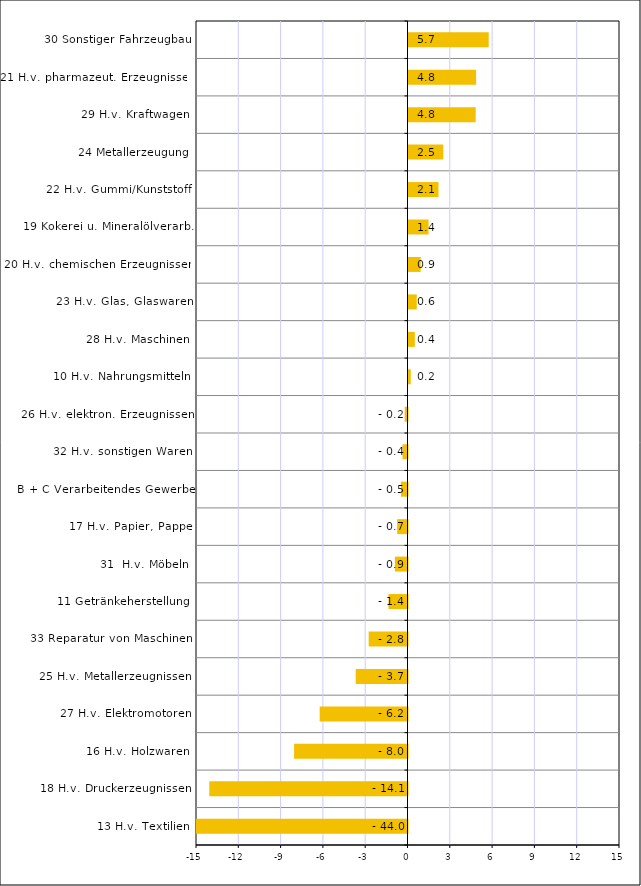
| Category | Series 0 |
|---|---|
| 13 H.v. Textilien | -43.973 |
| 18 H.v. Druckerzeugnissen | -14.057 |
| 16 H.v. Holzwaren | -8.045 |
| 27 H.v. Elektromotoren | -6.229 |
| 25 H.v. Metallerzeugnissen | -3.673 |
| 33 Reparatur von Maschinen | -2.754 |
| 11 Getränkeherstellung | -1.352 |
| 31  H.v. Möbeln | -0.896 |
| 17 H.v. Papier, Pappe | -0.734 |
| B + C Verarbeitendes Gewerbe | -0.466 |
| 32 H.v. sonstigen Waren | -0.354 |
| 26 H.v. elektron. Erzeugnissen | -0.197 |
| 10 H.v. Nahrungsmitteln | 0.16 |
| 28 H.v. Maschinen | 0.449 |
| 23 H.v. Glas, Glaswaren | 0.587 |
| 20 H.v. chemischen Erzeugnissen | 0.865 |
| 19 Kokerei u. Mineralölverarb. | 1.422 |
| 22 H.v. Gummi/Kunststoff | 2.128 |
| 24 Metallerzeugung | 2.466 |
| 29 H.v. Kraftwagen | 4.767 |
| 21 H.v. pharmazeut. Erzeugnissen | 4.794 |
| 30 Sonstiger Fahrzeugbau | 5.688 |